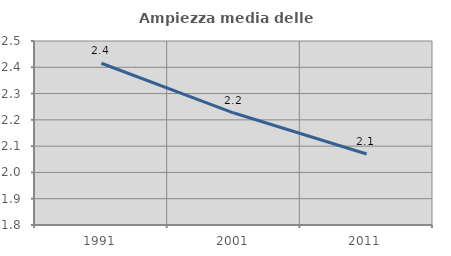
| Category | Ampiezza media delle famiglie |
|---|---|
| 1991.0 | 2.415 |
| 2001.0 | 2.226 |
| 2011.0 | 2.07 |